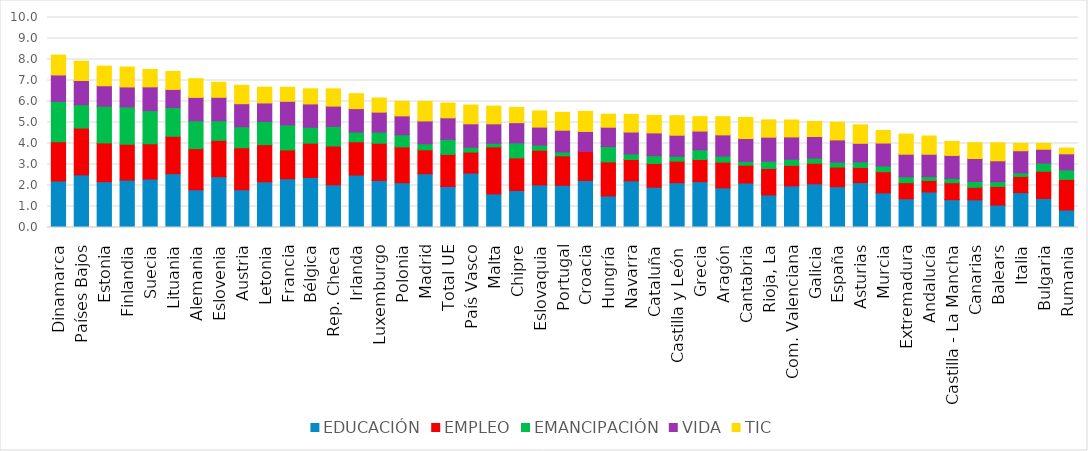
| Category | EDUCACIÓN | EMPLEO | EMANCIPACIÓN | VIDA | TIC |
|---|---|---|---|---|---|
| Dinamarca | 2.213 | 1.871 | 1.921 | 1.26 | 0.944 |
| Países Bajos | 2.504 | 2.232 | 1.111 | 1.152 | 0.92 |
| Estonia | 2.182 | 1.845 | 1.747 | 0.977 | 0.937 |
| Finlandia | 2.255 | 1.71 | 1.78 | 0.949 | 0.948 |
| Suecia | 2.307 | 1.68 | 1.579 | 1.131 | 0.83 |
| Lituania | 2.562 | 1.781 | 1.37 | 0.863 | 0.856 |
| Alemania | 1.793 | 1.961 | 1.329 | 1.112 | 0.89 |
| Eslovenia | 2.419 | 1.732 | 0.934 | 1.115 | 0.714 |
| Austria | 1.796 | 2.002 | 1 | 1.097 | 0.877 |
| Letonia | 2.173 | 1.772 | 1.101 | 0.885 | 0.752 |
| Francia | 2.318 | 1.376 | 1.194 | 1.122 | 0.669 |
| Bélgica | 2.383 | 1.632 | 0.759 | 1.11 | 0.719 |
| Rep. Checa | 2.032 | 1.848 | 0.933 | 0.968 | 0.823 |
| Irlanda | 2.496 | 1.583 | 0.464 | 1.117 | 0.712 |
| Luxemburgo | 2.239 | 1.772 | 0.533 | 0.949 | 0.675 |
| Polonia | 2.131 | 1.704 | 0.58 | 0.9 | 0.694 |
| Madrid | 2.557 | 1.142 | 0.292 | 1.084 | 0.93 |
| Total UE | 1.955 | 1.526 | 0.716 | 1.026 | 0.704 |
| País Vasco | 2.591 | 1.001 | 0.227 | 1.119 | 0.893 |
| Malta | 1.598 | 2.242 | 0.168 | 0.928 | 0.844 |
| Chipre | 1.759 | 1.555 | 0.717 | 0.961 | 0.727 |
| Eslovaquia | 2.025 | 1.653 | 0.249 | 0.855 | 0.769 |
| Portugal | 2.008 | 1.404 | 0.187 | 1.033 | 0.853 |
| Croacia | 2.239 | 1.383 | -0.061 | 0.952 | 0.957 |
| Hungría | 1.502 | 1.622 | 0.727 | 0.924 | 0.621 |
| Navarra | 2.221 | 1.018 | 0.27 | 1.038 | 0.84 |
| Cataluña | 1.918 | 1.129 | 0.375 | 1.082 | 0.836 |
| Castilla y León | 2.13 | 1.031 | 0.231 | 1.001 | 0.931 |
| Grecia | 2.182 | 1.056 | 0.462 | 0.891 | 0.688 |
| Aragón | 1.888 | 1.224 | 0.289 | 1.009 | 0.867 |
| Cantabria | 2.119 | 0.848 | 0.181 | 1.089 | 1.005 |
| Rioja, La | 1.548 | 1.261 | 0.352 | 1.139 | 0.824 |
| Com. Valenciana | 1.981 | 0.977 | 0.292 | 1.063 | 0.806 |
| Galicia | 2.08 | 0.979 | 0.247 | 1.03 | 0.717 |
| España | 1.941 | 0.938 | 0.236 | 1.057 | 0.841 |
| Asturias | 2.138 | 0.721 | 0.264 | 0.885 | 0.88 |
| Murcia | 1.648 | 1.009 | 0.275 | 1.089 | 0.598 |
| Extremadura | 1.366 | 0.768 | 0.278 | 1.078 | 0.957 |
| Andalucía | 1.692 | 0.549 | 0.183 | 1.065 | 0.87 |
| Castilla - La Mancha | 1.322 | 0.811 | 0.205 | 1.094 | 0.665 |
| Canarias | 1.317 | 0.598 | 0.275 | 1.097 | 0.752 |
| Balears | 1.067 | 0.884 | 0.23 | 0.996 | 0.855 |
| Italia | 1.659 | 0.775 | 0.167 | 1.055 | 0.352 |
| Bulgaria | 1.382 | 1.297 | 0.388 | 0.66 | 0.278 |
| Rumania | 0.83 | 1.459 | 0.453 | 0.766 | 0.274 |